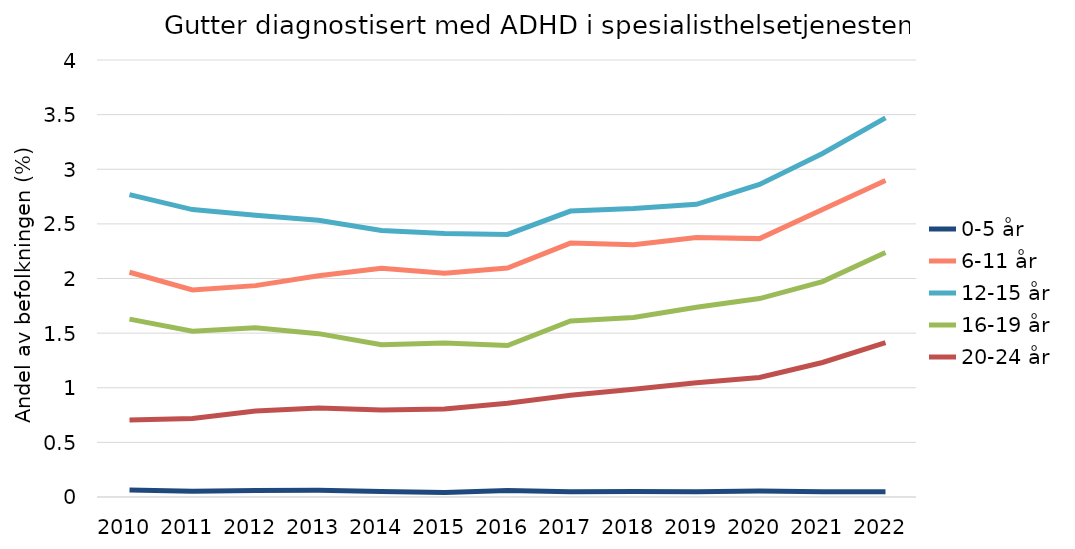
| Category | 0-5 år | 6-11 år | 12-15 år | 16-19 år | 20-24 år |
|---|---|---|---|---|---|
| 2010.0 | 0.065 | 2.057 | 2.767 | 1.628 | 0.704 |
| 2011.0 | 0.053 | 1.896 | 2.631 | 1.517 | 0.718 |
| 2012.0 | 0.059 | 1.935 | 2.579 | 1.549 | 0.788 |
| 2013.0 | 0.061 | 2.025 | 2.533 | 1.495 | 0.814 |
| 2014.0 | 0.051 | 2.095 | 2.439 | 1.394 | 0.797 |
| 2015.0 | 0.041 | 2.047 | 2.411 | 1.409 | 0.805 |
| 2016.0 | 0.058 | 2.096 | 2.404 | 1.386 | 0.858 |
| 2017.0 | 0.048 | 2.324 | 2.617 | 1.611 | 0.93 |
| 2018.0 | 0.051 | 2.31 | 2.641 | 1.643 | 0.987 |
| 2019.0 | 0.049 | 2.375 | 2.679 | 1.737 | 1.045 |
| 2020.0 | 0.054 | 2.365 | 2.861 | 1.816 | 1.094 |
| 2021.0 | 0.047 | 2.632 | 3.144 | 1.972 | 1.231 |
| 2022.0 | 0.049 | 2.896 | 3.47 | 2.237 | 1.413 |